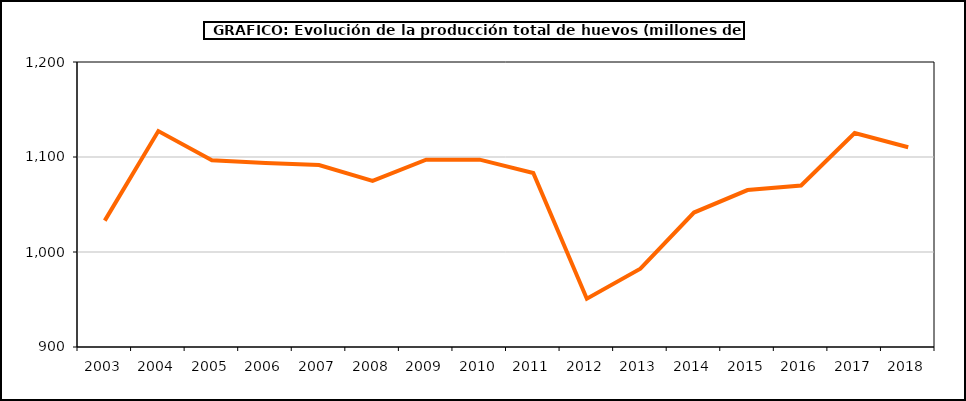
| Category | huevos |
|---|---|
| 2003.0 | 1033 |
| 2004.0 | 1127.271 |
| 2005.0 | 1096.54 |
| 2006.0 | 1093.721 |
| 2007.0 | 1091.465 |
| 2008.0 | 1074.834 |
| 2009.0 | 1097.178 |
| 2010.0 | 1097.2 |
| 2011.0 | 1083.082 |
| 2012.0 | 950.879 |
| 2013.0 | 982.375 |
| 2014.0 | 1041.522 |
| 2015.0 | 1065.202 |
| 2016.0 | 1070 |
| 2017.0 | 1125.287 |
| 2018.0 | 1110.274 |